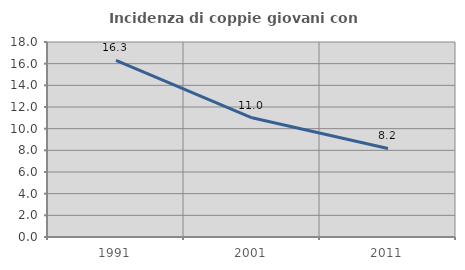
| Category | Incidenza di coppie giovani con figli |
|---|---|
| 1991.0 | 16.305 |
| 2001.0 | 11.002 |
| 2011.0 | 8.176 |